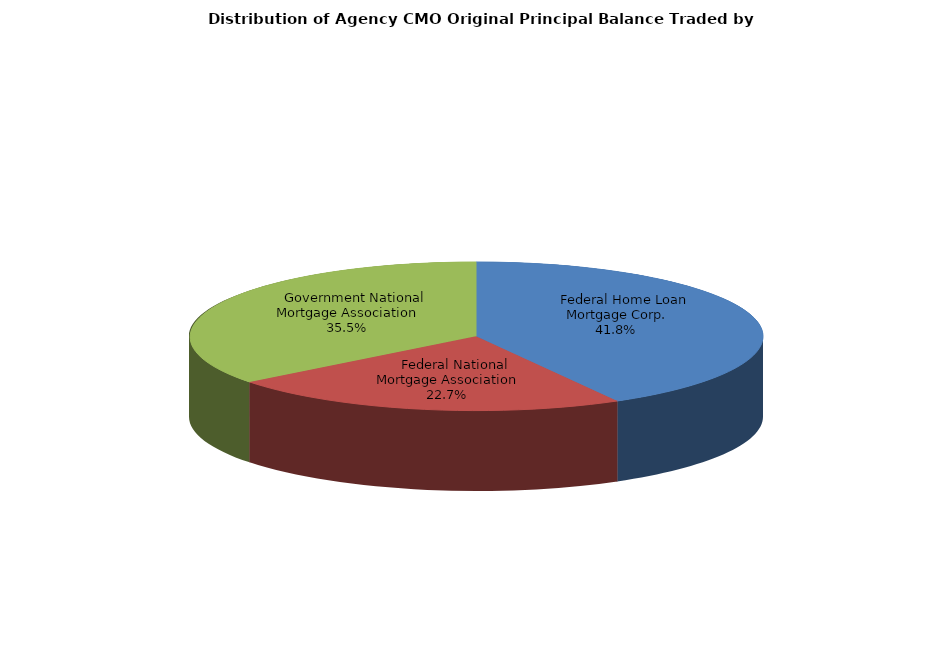
| Category | Series 0 |
|---|---|
|     Federal Home Loan Mortgage Corp. | 3047058753.446 |
|     Federal National Mortgage Association | 1651292525.991 |
|     Government National Mortgage Association | 2589722866.448 |